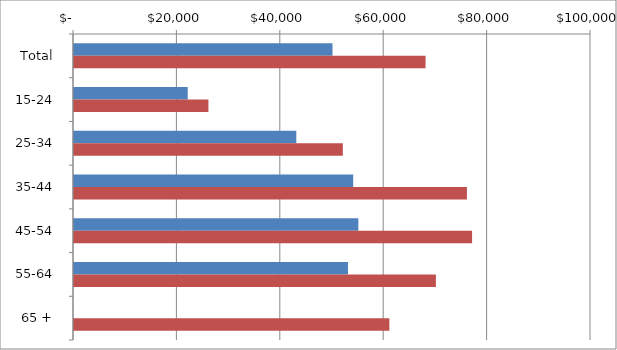
| Category | Series 0 | Series 1 |
|---|---|---|
| Total | 50000 | 68000 |
|  15-24  | 22000 | 26000 |
|  25-34  | 43000 | 52000 |
|  35-44  | 54000 | 76000 |
|  45-54  | 55000 | 77000 |
|  55-64  | 53000 | 70000 |
|  65 +  | 0 | 61000 |